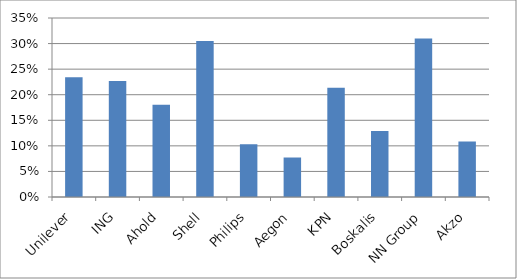
| Category | % Shareholders that receive no foreign tax compensation |
|---|---|
| Unilever | 0.234 |
| ING | 0.227 |
| Ahold | 0.18 |
| Shell | 0.305 |
| Philips | 0.103 |
| Aegon | 0.077 |
| KPN | 0.214 |
| Boskalis | 0.129 |
| NN Group | 0.31 |
| Akzo | 0.109 |